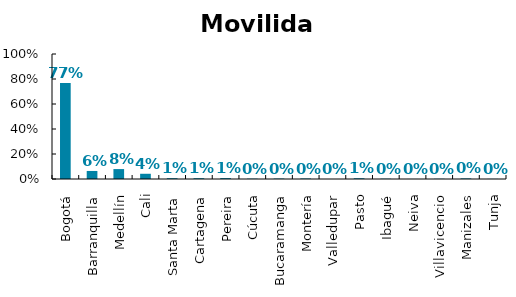
| Category | Movilidad |
|---|---|
| Bogotá | 0.769 |
| Barranquilla | 0.064 |
| Medellín | 0.079 |
| Cali | 0.042 |
| Santa Marta | 0.006 |
| Cartagena | 0.006 |
| Pereira | 0.007 |
| Cúcuta | 0.003 |
| Bucaramanga | 0.003 |
| Montería | 0.004 |
| Valledupar | 0 |
| Pasto | 0.006 |
| Ibagué | 0.002 |
| Neiva | 0.001 |
| Villavicencio | 0.002 |
| Manizales | 0.005 |
| Tunja | 0.001 |